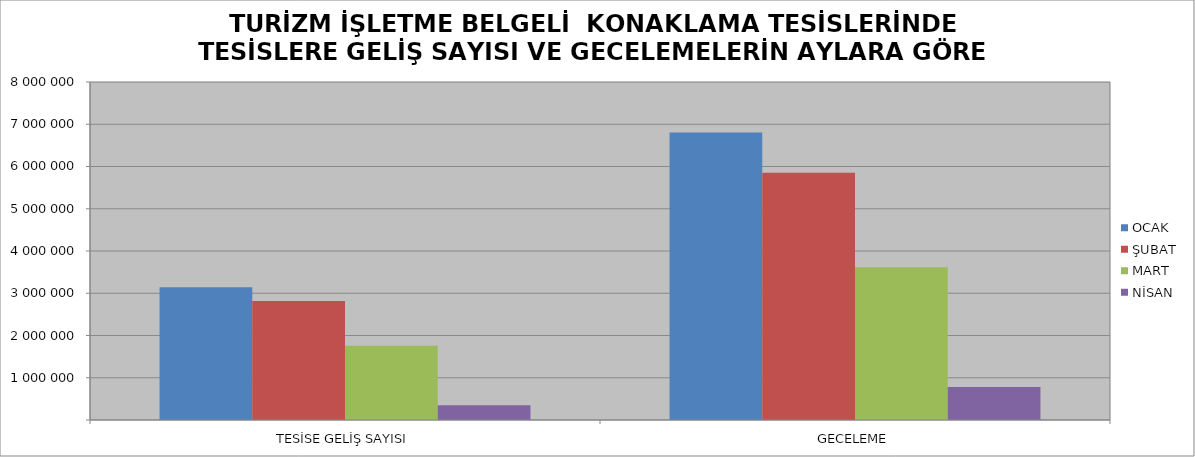
| Category | OCAK | ŞUBAT | MART | NİSAN |
|---|---|---|---|---|
| TESİSE GELİŞ SAYISI | 3140857 | 2816145 | 1756166 | 346964 |
| GECELEME | 6806196 | 5853519 | 3616071 | 781724 |